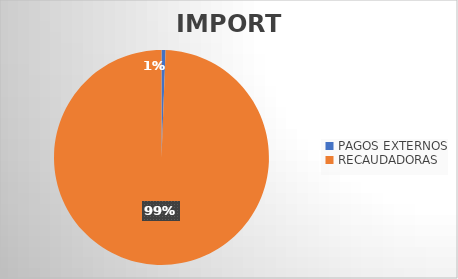
| Category | IMPORTE |
|---|---|
| PAGOS EXTERNOS | 1088560.63 |
| RECAUDADORAS | 177406269.06 |